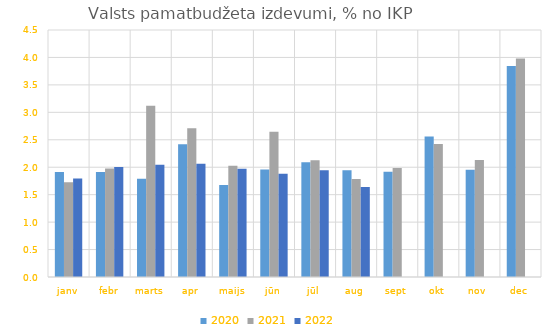
| Category | 2020 | 2021 | 2022 |
|---|---|---|---|
| janv | 1.914 | 1.727 | 1.797 |
| febr | 1.912 | 1.976 | 2.006 |
| marts | 1.791 | 3.118 | 2.046 |
| apr | 2.419 | 2.71 | 2.065 |
| maijs | 1.676 | 2.028 | 1.972 |
| jūn | 1.959 | 2.644 | 1.881 |
| jūl | 2.088 | 2.125 | 1.944 |
| aug | 1.945 | 1.787 | 1.64 |
| sept | 1.917 | 1.987 | 0 |
| okt | 2.561 | 2.421 | 0 |
| nov | 1.954 | 2.13 | 0 |
| dec | 3.844 | 3.981 | 0 |